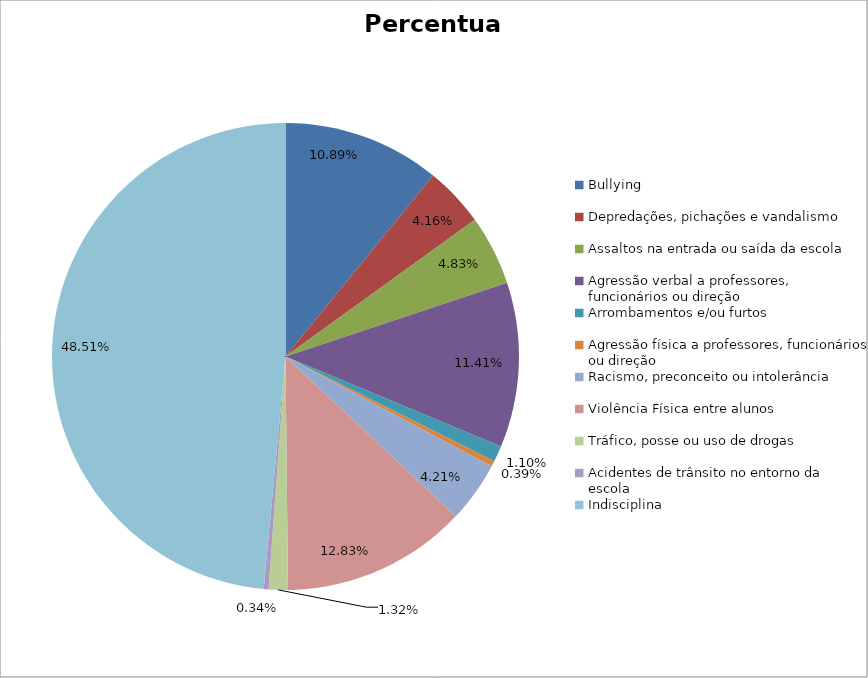
| Category | Percentual |
|---|---|
| Bullying | 0.109 |
| Depredações, pichações e vandalismo | 0.042 |
| Assaltos na entrada ou saída da escola | 0.048 |
| Agressão verbal a professores, funcionários ou direção | 0.114 |
| Arrombamentos e/ou furtos | 0.011 |
| Agressão física a professores, funcionários ou direção | 0.004 |
| Racismo, preconceito ou intolerância | 0.042 |
| Violência Física entre alunos | 0.128 |
| Tráfico, posse ou uso de drogas | 0.013 |
| Acidentes de trânsito no entorno da escola | 0.003 |
| Indisciplina | 0.485 |